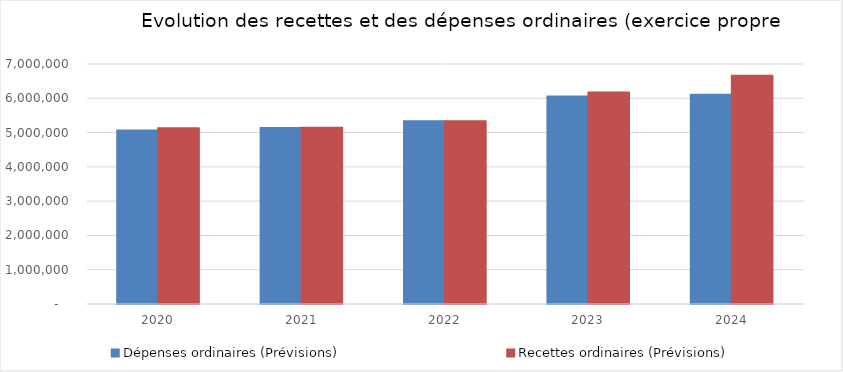
| Category | Dépenses ordinaires (Prévisions) | Recettes ordinaires (Prévisions) |
|---|---|---|
| 2020.0 | 5048416.1 | 5110437.35 |
| 2021.0 | 5115727.41 | 5124014.9 |
| 2022.0 | 5316090.05 | 5316394.09 |
| 2023.0 | 6039753.34 | 6155523.75 |
| 2024.0 | 6090775.05 | 6639798.73 |